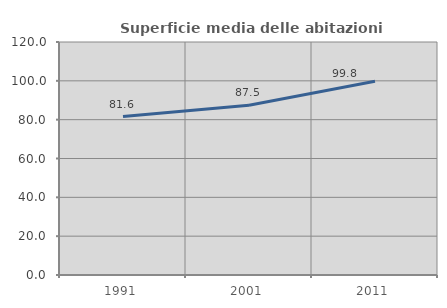
| Category | Superficie media delle abitazioni occupate |
|---|---|
| 1991.0 | 81.593 |
| 2001.0 | 87.458 |
| 2011.0 | 99.819 |